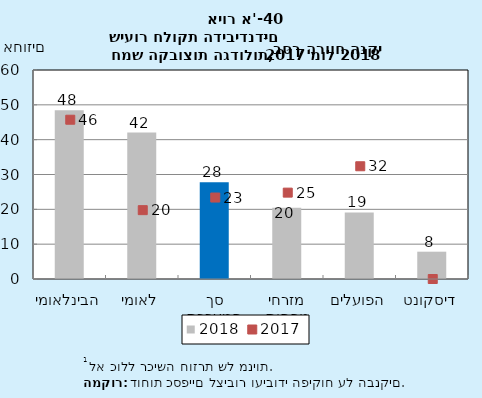
| Category | 2018 |
|---|---|
| הבינלאומי | 48.431 |
| לאומי | 42.033 |
| סך המערכת | 27.808 |
| מזרחי טפחות | 20.481 |
| הפועלים | 19.114 |
| דיסקונט | 7.841 |